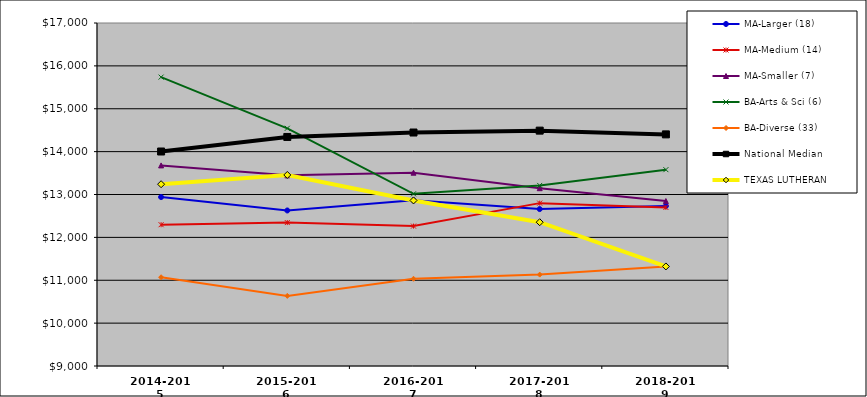
| Category | MA-Larger (18) | MA-Medium (14) | MA-Smaller (7) | BA-Arts & Sci (6) | BA-Diverse (33) | National Median |  TEXAS LUTHERAN  |
|---|---|---|---|---|---|---|---|
| 2014-2015 | 12940.361 | 12295.38 | 13678.394 | 15737.652 | 11069.703 | 14002.887 | 13239.91 |
| 2015-2016 | 12627.66 | 12345.257 | 13446.5 | 14544.116 | 10634.985 | 14342.086 | 13456.186 |
| 2016-2017 | 12865.251 | 12262.824 | 13508.789 | 13016.113 | 11034.339 | 14445.621 | 12861.172 |
| 2017-2018 | 12659.881 | 12798.501 | 13147.193 | 13211.615 | 11131.615 | 14489.448 | 12353.524 |
| 2018-2019 | 12732.571 | 12697.534 | 12847.103 | 13579.379 | 11322.153 | 14402.238 | 11322.153 |